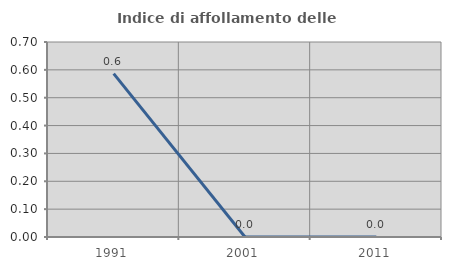
| Category | Indice di affollamento delle abitazioni  |
|---|---|
| 1991.0 | 0.587 |
| 2001.0 | 0 |
| 2011.0 | 0 |